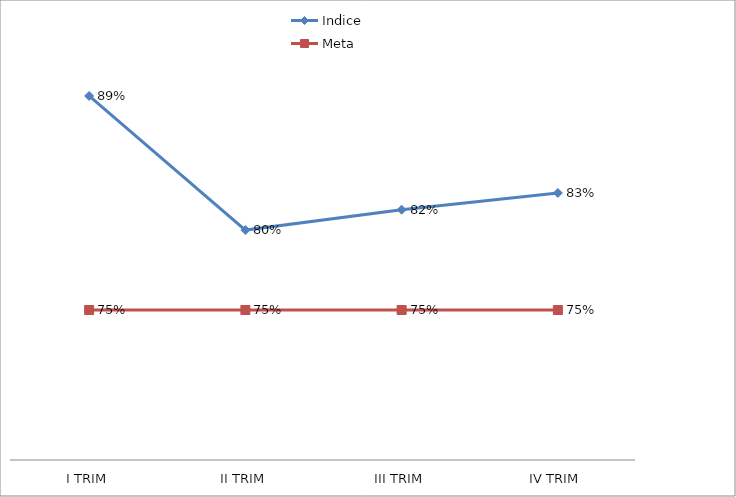
| Category | Indice | Meta |
|---|---|---|
| I TRIM | 0.893 | 0.75 |
| II TRIM | 0.803 | 0.75 |
| III TRIM | 0.817 | 0.75 |
| IV TRIM | 0.828 | 0.75 |